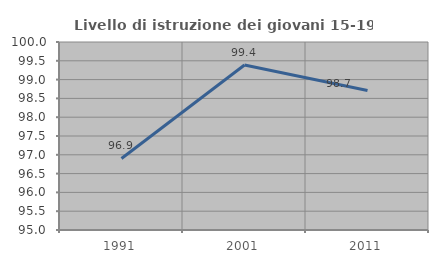
| Category | Livello di istruzione dei giovani 15-19 anni |
|---|---|
| 1991.0 | 96.903 |
| 2001.0 | 99.387 |
| 2011.0 | 98.71 |